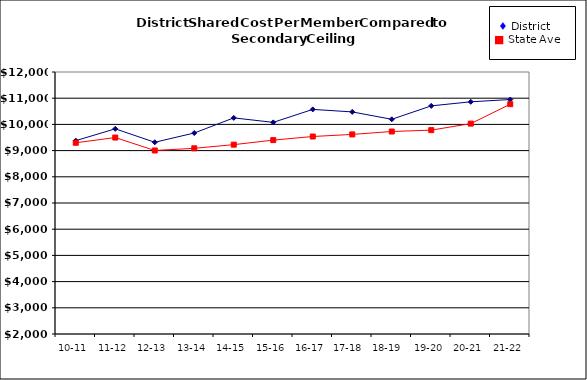
| Category | Series 0 | Series 1 |
|---|---|---|
| 10-11 | 9379.13 | 9299 |
| 11-12 | 9831.52 | 9498 |
| 12-13 | 9317.57 | 9005 |
| 13-14 | 9671.18 | 9087 |
| 14-15 | 10248.99 | 9227 |
| 15-16 | 10077.39 | 9401 |
| 16-17 | 10572.42 | 9538 |
| 17-18  | 10476.6 | 9618 |
| 18-19  | 10194.34 | 9729 |
| 19-20 | 10707.17 | 9781 |
| 20-21 | 10862.2 | 10030 |
| 21-22 | 10949.96 | 10771 |